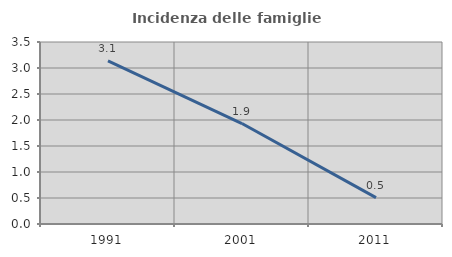
| Category | Incidenza delle famiglie numerose |
|---|---|
| 1991.0 | 3.139 |
| 2001.0 | 1.932 |
| 2011.0 | 0.508 |